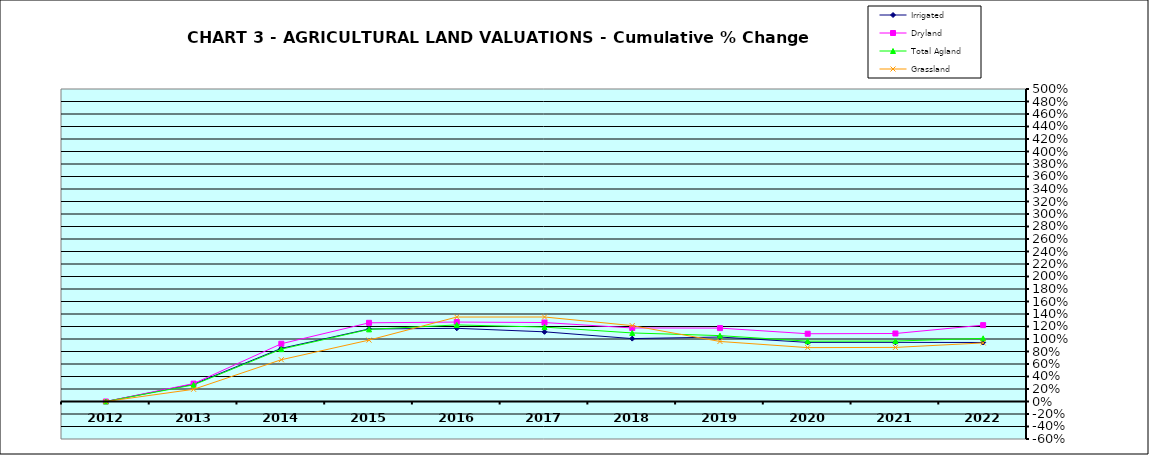
| Category | Irrigated | Dryland | Total Agland | Grassland |
|---|---|---|---|---|
| 2012.0 | 0 | 0 | 0 | 0 |
| 2013.0 | 0.277 | 0.287 | 0.266 | 0.195 |
| 2014.0 | 0.85 | 0.924 | 0.838 | 0.669 |
| 2015.0 | 1.16 | 1.259 | 1.154 | 0.982 |
| 2016.0 | 1.171 | 1.271 | 1.225 | 1.351 |
| 2017.0 | 1.115 | 1.263 | 1.191 | 1.352 |
| 2018.0 | 1.006 | 1.177 | 1.097 | 1.214 |
| 2019.0 | 1.031 | 1.174 | 1.054 | 0.961 |
| 2020.0 | 0.946 | 1.084 | 0.965 | 0.862 |
| 2021.0 | 0.946 | 1.088 | 0.967 | 0.865 |
| 2022.0 | 0.944 | 1.222 | 1.01 | 0.937 |